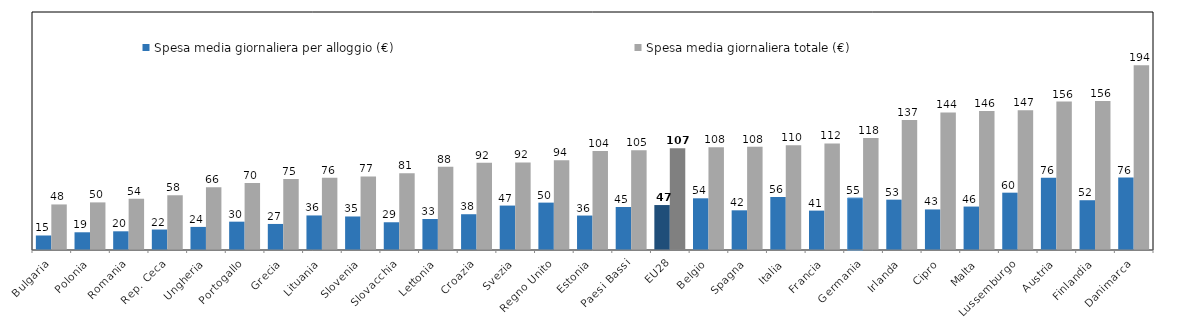
| Category | Spesa media giornaliera per alloggio (€) | Spesa media giornaliera totale (€) |
|---|---|---|
| Bulgaria | 15.246 | 47.862 |
| Polonia | 18.614 | 50.005 |
| Romania | 19.637 | 53.89 |
| Rep. Ceca | 21.503 | 57.502 |
| Ungheria | 24.251 | 65.929 |
| Portogallo | 29.759 | 70.271 |
| Grecia | 27.36 | 74.543 |
| Lituania | 36.294 | 75.778 |
| Slovenia | 35.214 | 77.276 |
| Slovacchia | 29.139 | 80.668 |
| Lettonia | 32.582 | 87.536 |
| Croazia | 37.575 | 91.561 |
| Svezia | 46.673 | 91.949 |
| Regno Unito | 49.77 | 94.199 |
| Estonia | 36.193 | 103.866 |
| Paesi Bassi | 45.194 | 104.712 |
| EU28 | 47.225 | 106.979 |
| Belgio | 54.303 | 107.836 |
| Spagna | 41.684 | 108.338 |
| Italia | 55.67 | 110.091 |
| Francia | 41.377 | 111.997 |
| Germania | 54.59 | 117.617 |
| Irlanda | 52.888 | 136.605 |
| Cipro | 42.612 | 144.478 |
| Malta | 45.628 | 146.122 |
| Lussemburgo | 60.218 | 146.838 |
| Austria | 75.836 | 155.902 |
| Finlandia | 52.283 | 156.41 |
| Danimarca | 76.129 | 194.091 |